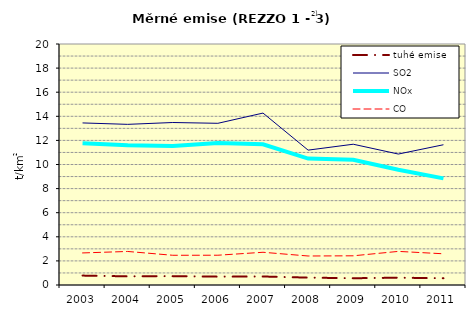
| Category | tuhé emise | SO2 | NOx | CO |
|---|---|---|---|---|
| 2003.0 | 0.78 | 13.449 | 11.768 | 2.661 |
| 2004.0 | 0.719 | 13.332 | 11.604 | 2.784 |
| 2005.0 | 0.735 | 13.485 | 11.535 | 2.466 |
| 2006.0 | 0.694 | 13.419 | 11.782 | 2.471 |
| 2007.0 | 0.706 | 14.268 | 11.675 | 2.715 |
| 2008.0 | 0.613 | 11.192 | 10.491 | 2.407 |
| 2009.0 | 0.562 | 11.683 | 10.389 | 2.423 |
| 2010.0 | 0.605 | 10.867 | 9.563 | 2.789 |
| 2011.0 | 0.564 | 11.64 | 8.847 | 2.59 |